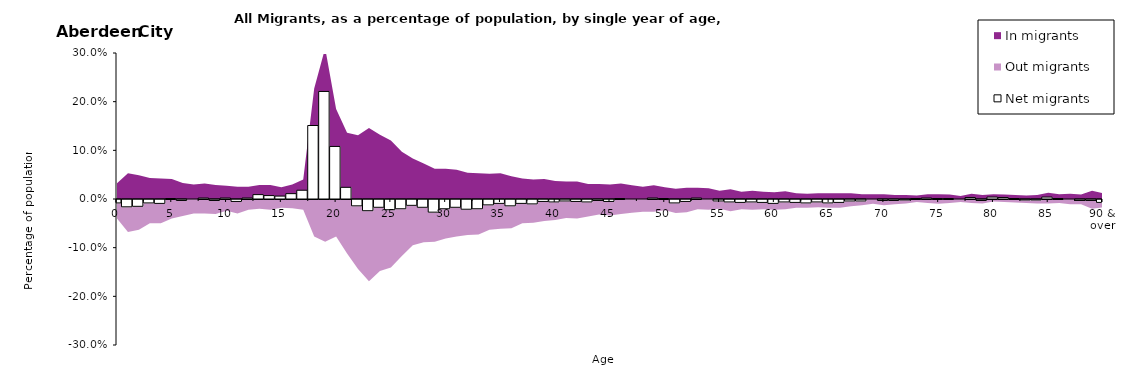
| Category |  Net migrants |
|---|---|
| 0 | -0.007 |
| 1 | -0.015 |
| 2 | -0.014 |
| 3 | -0.007 |
| 4 | -0.008 |
| 5 | 0.001 |
| 6 | -0.002 |
| 7 | 0 |
| 8 | 0.002 |
| 9 | -0.002 |
| 10 | 0.002 |
| 11 | -0.004 |
| 12 | 0.002 |
| 13 | 0.009 |
| 14 | 0.007 |
| 15 | 0.006 |
| 16 | 0.011 |
| 17 | 0.018 |
| 18 | 0.151 |
| 19 | 0.221 |
| 20 | 0.108 |
| 21 | 0.024 |
| 22 | -0.013 |
| 23 | -0.023 |
| 24 | -0.016 |
| 25 | -0.021 |
| 26 | -0.019 |
| 27 | -0.012 |
| 28 | -0.016 |
| 29 | -0.026 |
| 30 | -0.019 |
| 31 | -0.016 |
| 32 | -0.02 |
| 33 | -0.019 |
| 34 | -0.011 |
| 35 | -0.008 |
| 36 | -0.013 |
| 37 | -0.008 |
| 38 | -0.009 |
| 39 | -0.004 |
| 40 | -0.005 |
| 41 | -0.003 |
| 42 | -0.004 |
| 43 | -0.005 |
| 44 | -0.002 |
| 45 | -0.004 |
| 46 | 0.001 |
| 47 | 0 |
| 48 | 0 |
| 49 | 0.002 |
| 50 | 0.001 |
| 51 | -0.007 |
| 52 | -0.004 |
| 53 | 0.002 |
| 54 | 0 |
| 55 | -0.003 |
| 56 | -0.005 |
| 57 | -0.006 |
| 58 | -0.005 |
| 59 | -0.006 |
| 60 | -0.008 |
| 61 | -0.005 |
| 62 | -0.006 |
| 63 | -0.007 |
| 64 | -0.005 |
| 65 | -0.007 |
| 66 | -0.006 |
| 67 | -0.003 |
| 68 | -0.003 |
| 69 | 0 |
| 70 | -0.002 |
| 71 | -0.002 |
| 72 | -0.001 |
| 73 | 0.001 |
| 74 | 0.002 |
| 75 | 0.001 |
| 76 | 0.001 |
| 77 | 0 |
| 78 | 0.003 |
| 79 | -0.002 |
| 80 | 0.004 |
| 81 | 0.003 |
| 82 | 0.001 |
| 83 | -0.001 |
| 84 | -0.001 |
| 85 | 0.004 |
| 86 | 0.001 |
| 87 | 0 |
| 88 | -0.002 |
| 89 | -0.002 |
| 90 & over | -0.006 |